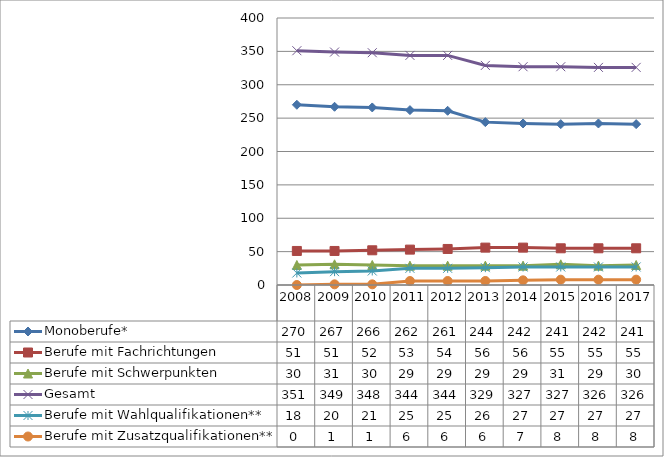
| Category | Monoberufe* | Berufe mit Fachrichtungen | Berufe mit Schwerpunkten | Gesamt | Berufe mit Wahlqualifikationen** | Berufe mit Zusatzqualifikationen** |
|---|---|---|---|---|---|---|
| 2008.0 | 270 | 51 | 30 | 351 | 18 | 0 |
| 2009.0 | 267 | 51 | 31 | 349 | 20 | 1 |
| 2010.0 | 266 | 52 | 30 | 348 | 21 | 1 |
| 2011.0 | 262 | 53 | 29 | 344 | 25 | 6 |
| 2012.0 | 261 | 54 | 29 | 344 | 25 | 6 |
| 2013.0 | 244 | 56 | 29 | 329 | 26 | 6 |
| 2014.0 | 242 | 56 | 29 | 327 | 27 | 7 |
| 2015.0 | 241 | 55 | 31 | 327 | 27 | 8 |
| 2016.0 | 242 | 55 | 29 | 326 | 27 | 8 |
| 2017.0 | 241 | 55 | 30 | 326 | 27 | 8 |